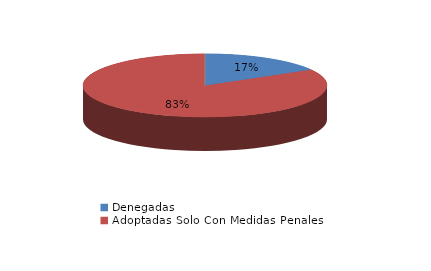
| Category | Series 0 |
|---|---|
| Denegadas | 1 |
| Adoptadas Solo Con Medidas Penales | 5 |
| Adoptadas Con Medidas Civiles Y Penales | 0 |
| Adoptadas Con Medidas Solo Civiles | 0 |